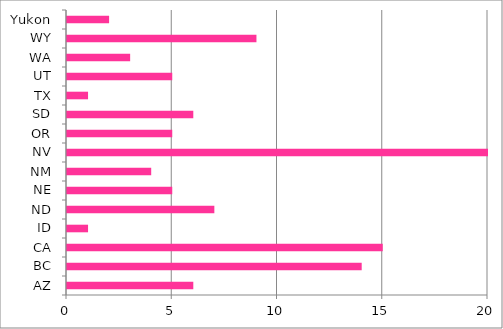
| Category | Series 0 |
|---|---|
| AZ | 6 |
| BC | 14 |
| CA | 15 |
| ID | 1 |
| ND | 7 |
| NE | 5 |
| NM | 4 |
| NV | 20 |
| OR | 5 |
| SD | 6 |
| TX | 1 |
| UT | 5 |
| WA | 3 |
| WY | 9 |
| Yukon | 2 |